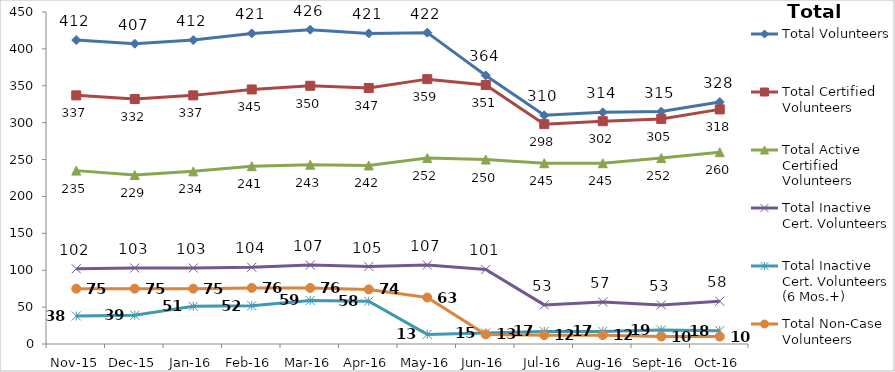
| Category | Total Volunteers | Total Certified Volunteers | Total Active Certified Volunteers | Total Inactive Cert. Volunteers | Total Inactive Cert. Volunteers (6 Mos.+) | Total Non-Case Volunteers |
|---|---|---|---|---|---|---|
| Nov-15 | 412 | 337 | 235 | 102 | 38 | 75 |
| Dec-15 | 407 | 332 | 229 | 103 | 39 | 75 |
| Jan-16 | 412 | 337 | 234 | 103 | 51 | 75 |
| Feb-16 | 421 | 345 | 241 | 104 | 52 | 76 |
| Mar-16 | 426 | 350 | 243 | 107 | 59 | 76 |
| Apr-16 | 421 | 347 | 242 | 105 | 58 | 74 |
| May-16 | 422 | 359 | 252 | 107 | 13 | 63 |
| Jun-16 | 364 | 351 | 250 | 101 | 15 | 13 |
| Jul-16 | 310 | 298 | 245 | 53 | 17 | 12 |
| Aug-16 | 314 | 302 | 245 | 57 | 17 | 12 |
| Sep-16 | 315 | 305 | 252 | 53 | 19 | 10 |
| Oct-16 | 328 | 318 | 260 | 58 | 18 | 10 |